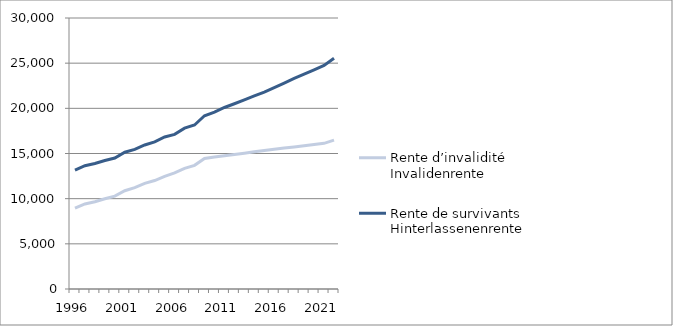
| Category | Rente d’invalidité | Rente de survivants |
|---|---|---|
| 1996.0 | 8940 | 13152 |
| 1997.0 | 9414 | 13650 |
| 1998.0 | 9660 | 13896 |
| 1999.0 | 9984 | 14226 |
| 2000.0 | 10284 | 14502 |
| 2001.0 | 10878 | 15144 |
| 2002.0 | 11214 | 15456 |
| 2003.0 | 11688 | 15942 |
| 2004.0 | 12006 | 16290 |
| 2005.0 | 12468 | 16830 |
| 2006.0 | 12858 | 17118 |
| 2007.0 | 13350 | 17802 |
| 2008.0 | 13692 | 18150 |
| 2009.0 | 14454 | 19182 |
| 2010.0 | 14604 | 19578 |
| 2011.0 | 14754 | 20094 |
| 2012.0 | 14886.78 | 20507.34 |
| 2013.0 | 15032.04 | 20943.24 |
| 2014.0 | 15189.96 | 21371.64 |
| 2015.0 | 15337.86 | 21802.62 |
| 2016.0 | 15472.56 | 22296.9 |
| 2017.0 | 15607.8 | 22801.74 |
| 2018.0 | 15732 | 23304 |
| 2019.0 | 15864 | 23784 |
| 2020.0 | 15996 | 24252 |
| 2021.0 | 16128 | 24744 |
| 2022.0 | 16476 | 25548 |